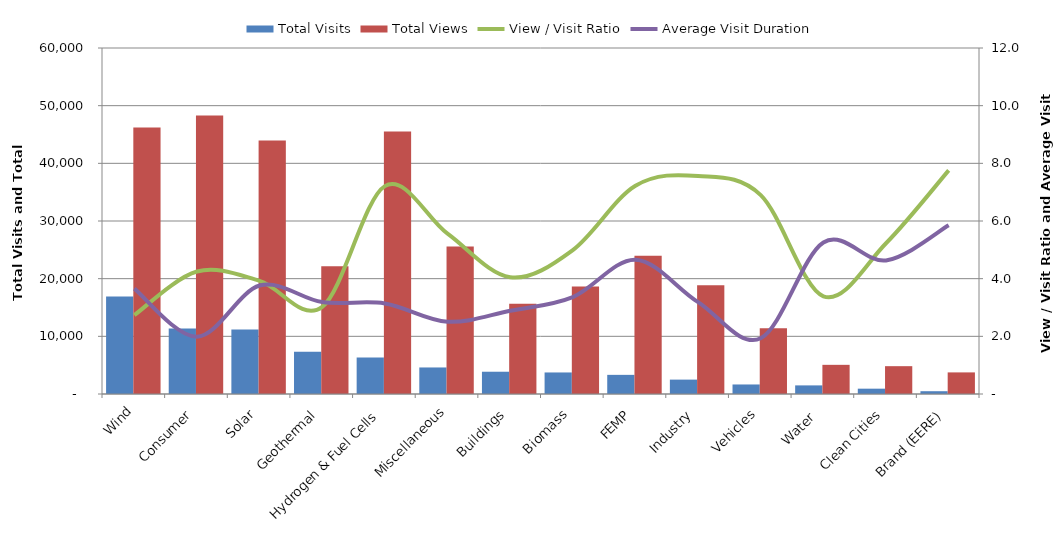
| Category | Total Visits | Total Views |
|---|---|---|
| Wind | 16888 | 46203 |
| Consumer | 11371 | 48310 |
| Solar | 11204 | 43958 |
| Geothermal | 7336 | 22165 |
| Hydrogen & Fuel Cells | 6315 | 45530 |
| Miscellaneous | 4603 | 25584 |
| Buildings | 3862 | 15634 |
| Biomass | 3735 | 18651 |
| FEMP | 3319 | 23975 |
| Industry | 2495 | 18866 |
| Vehicles | 1653 | 11404 |
| Water  | 1493 | 5057 |
| Clean Cities | 923 | 4826 |
| Brand (EERE) | 483 | 3746 |